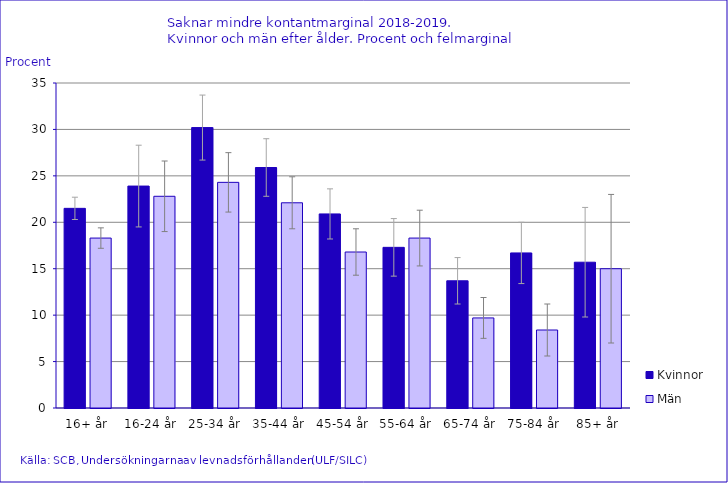
| Category | Kvinnor | Män |
|---|---|---|
| 16+ år | 21.5 | 18.3 |
| 16-24 år | 23.9 | 22.8 |
| 25-34 år | 30.2 | 24.3 |
| 35-44 år | 25.9 | 22.1 |
| 45-54 år | 20.9 | 16.8 |
| 55-64 år | 17.3 | 18.3 |
| 65-74 år | 13.7 | 9.7 |
| 75-84 år | 16.7 | 8.4 |
| 85+ år | 15.7 | 15 |